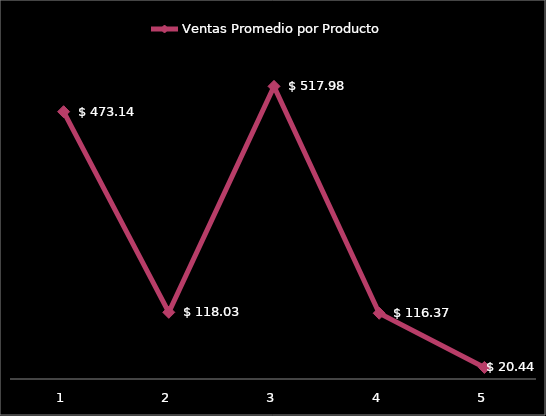
| Category | Ventas Promedio por Producto |
|---|---|
| 0 | 473.141 |
| 1 | 118.026 |
| 2 | 517.983 |
| 3 | 116.365 |
| 4 | 20.444 |